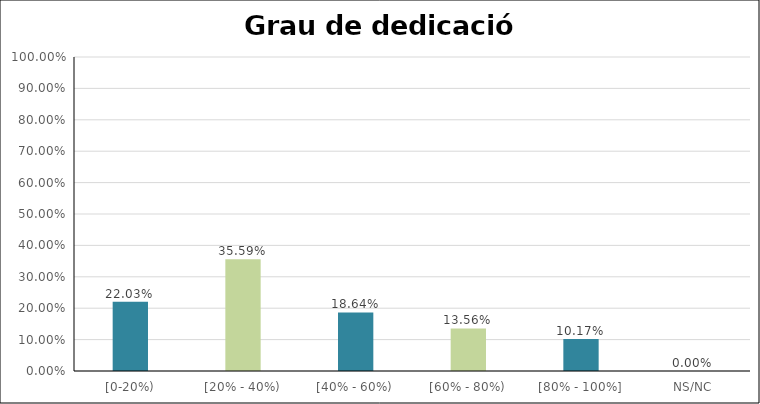
| Category | Series 0 |
|---|---|
| [0-20%) | 0.22 |
| [20% - 40%) | 0.356 |
| [40% - 60%) | 0.186 |
| [60% - 80%) | 0.136 |
| [80% - 100%] | 0.102 |
| NS/NC | 0 |